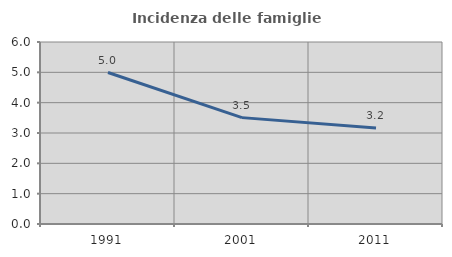
| Category | Incidenza delle famiglie numerose |
|---|---|
| 1991.0 | 4.994 |
| 2001.0 | 3.507 |
| 2011.0 | 3.168 |